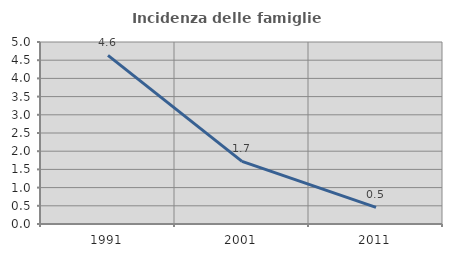
| Category | Incidenza delle famiglie numerose |
|---|---|
| 1991.0 | 4.634 |
| 2001.0 | 1.719 |
| 2011.0 | 0.455 |